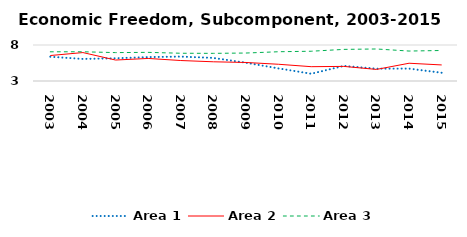
| Category | Area 1 | Area 2 | Area 3 |
|---|---|---|---|
| 2003.0 | 6.369 | 6.538 | 7.055 |
| 2004.0 | 6.064 | 6.95 | 7.059 |
| 2005.0 | 6.157 | 5.911 | 6.944 |
| 2006.0 | 6.319 | 6.132 | 6.978 |
| 2007.0 | 6.392 | 5.844 | 6.854 |
| 2008.0 | 6.207 | 5.669 | 6.841 |
| 2009.0 | 5.535 | 5.573 | 6.884 |
| 2010.0 | 4.747 | 5.322 | 7.065 |
| 2011.0 | 4.007 | 4.99 | 7.134 |
| 2012.0 | 5.096 | 5.028 | 7.391 |
| 2013.0 | 4.712 | 4.607 | 7.447 |
| 2014.0 | 4.722 | 5.467 | 7.16 |
| 2015.0 | 4.14 | 5.229 | 7.237 |